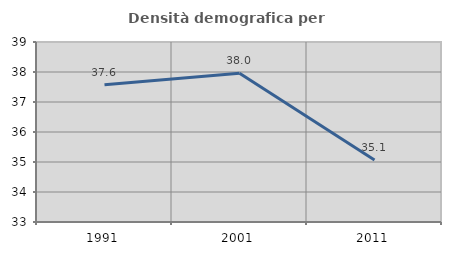
| Category | Densità demografica |
|---|---|
| 1991.0 | 37.572 |
| 2001.0 | 37.96 |
| 2011.0 | 35.067 |